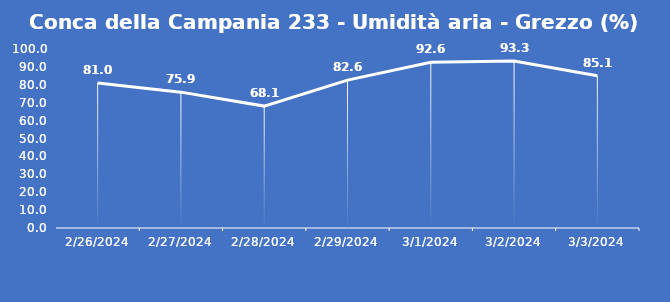
| Category | Conca della Campania 233 - Umidità aria - Grezzo (%) |
|---|---|
| 2/26/24 | 81 |
| 2/27/24 | 75.9 |
| 2/28/24 | 68.1 |
| 2/29/24 | 82.6 |
| 3/1/24 | 92.6 |
| 3/2/24 | 93.3 |
| 3/3/24 | 85.1 |